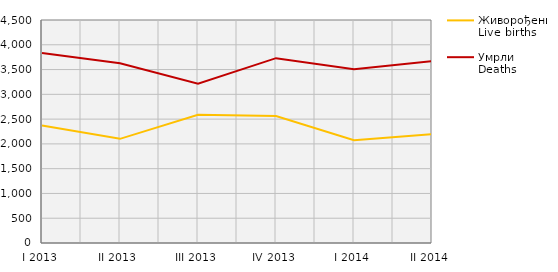
| Category | Живорођени
Live births | Умрли
Deaths |
|---|---|---|
| I 2013 | 2369 | 3833 |
| II 2013 | 2102 | 3626 |
| III 2013 | 2587 | 3214 |
| IV 2013 | 2561 | 3730 |
| I 2014 | 2076 | 3505 |
| II 2014 | 2197 | 3669 |